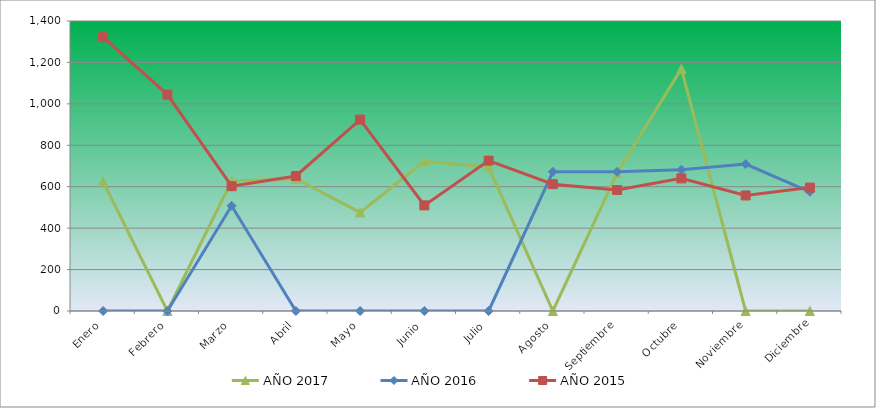
| Category | AÑO 2017 | AÑO 2016 | AÑO 2015 |
|---|---|---|---|
| Enero | 624.792 | 0 | 1321.782 |
| Febrero | 0 | 0 | 1044.554 |
| Marzo | 628.215 | 507.793 | 602.31 |
| Abril | 638.486 | 0 | 651.815 |
| Mayo | 475.869 | 0 | 924.092 |
| Junio | 722.362 | 0 | 509.901 |
| Julio | 694.974 | 0 | 726.073 |
| Agosto | 0 | 671.979 | 612.211 |
| Septiembre | 665.874 | 671.979 | 584.158 |
| Octubre | 1169.131 | 682.135 | 640.264 |
| Noviembre | 0 | 709.217 | 557.756 |
| Diciembre | 0 | 575.499 | 595.71 |